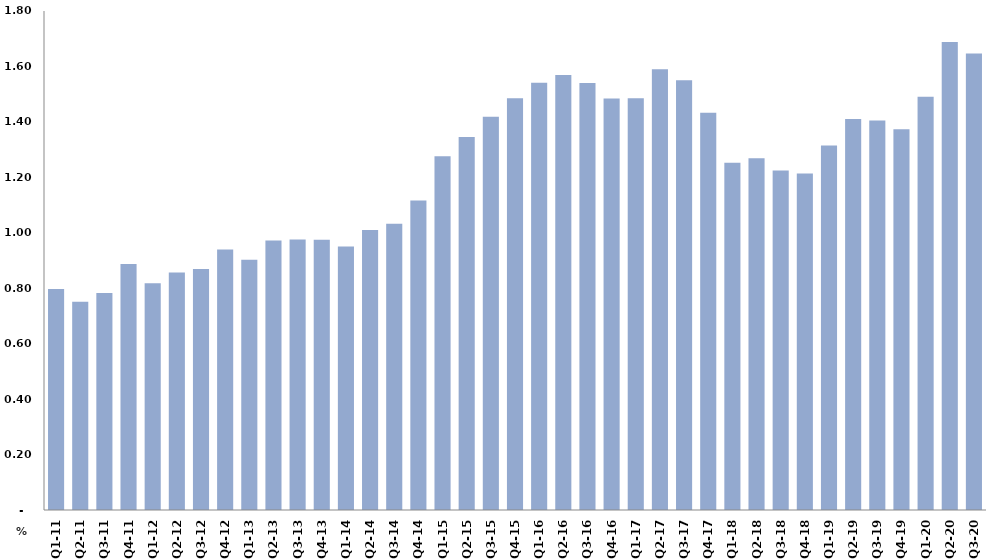
| Category | النسبة المئوية من الناتج المحلي الاجمالي
Percent of Total GDP |
|---|---|
| Q1-11 | 0.797 |
| Q2-11 | 0.751 |
| Q3-11 | 0.783 |
| Q4-11 | 0.887 |
| Q1-12 | 0.818 |
| Q2-12 | 0.857 |
| Q3-12 | 0.869 |
| Q4-12 | 0.94 |
| Q1-13 | 0.903 |
| Q2-13 | 0.972 |
| Q3-13 | 0.976 |
| Q4-13 | 0.975 |
| Q1-14 | 0.95 |
| Q2-14 | 1.01 |
| Q3-14 | 1.032 |
| Q4-14 | 1.117 |
| Q1-15 | 1.276 |
| Q2-15 | 1.345 |
| Q3-15 | 1.419 |
| Q4-15 | 1.485 |
| Q1-16 | 1.541 |
| Q2-16 | 1.57 |
| Q3-16 | 1.54 |
| Q4-16 | 1.484 |
| Q1-17 | 1.485 |
| Q2-17 | 1.59 |
| Q3-17 | 1.55 |
| Q4-17 | 1.433 |
| Q1-18 | 1.253 |
| Q2-18 | 1.268 |
| Q3-18 | 1.225 |
| Q4-18 | 1.214 |
| Q1-19 | 1.314 |
| Q2-19 | 1.41 |
| Q3-19 | 1.405 |
| Q4-19 | 1.374 |
| Q1-20 | 1.49 |
| Q2-20 | 1.688 |
| Q3-20 | 1.646 |